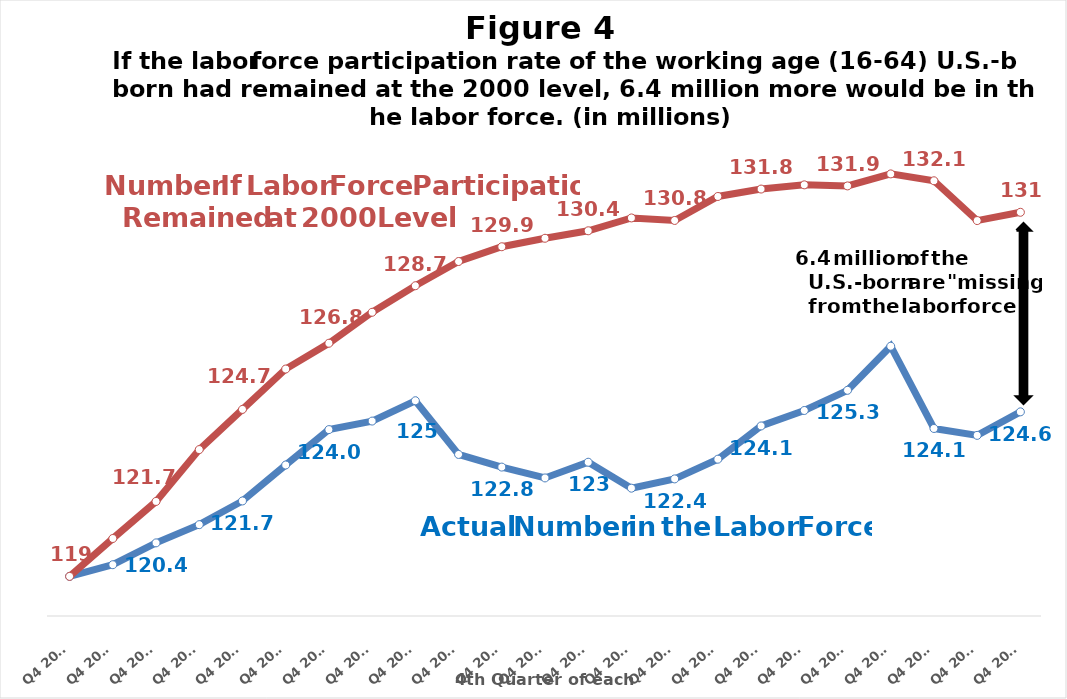
| Category |  Actual number  in the labor force  | Series 1 |
|---|---|---|
| Q4 2000 | 119.279 | 119.279 |
| Q4 2001 | 119.656 | 120.503 |
| Q4 2002 | 120.361 | 121.699 |
| Q4 2003 | 120.95 | 123.374 |
| Q4 2004 | 121.715 | 124.672 |
| Q4 2005 | 122.876 | 125.975 |
| Q4 2006 | 124.019 | 126.808 |
| Q4 2007 | 124.295 | 127.809 |
| Q4 2008 | 124.951 | 128.666 |
| Q4 2009 | 123.217 | 129.448 |
| Q4 2010 | 122.809 | 129.924 |
| Q4 2011 | 122.458 | 130.199 |
| Q4 2012 | 122.966 | 130.44 |
| Q4 2013 | 122.128 | 130.855 |
| Q4 2014 | 122.427 | 130.774 |
| Q4 2015 | 123.064 | 131.548 |
| Q4 2016 | 124.138 | 131.788 |
| Q4 2017 | 124.637 | 131.923 |
| Q4 2018 | 125.288 | 131.889 |
| Q4 2019 | 126.712 | 132.277 |
| Q4 2020 | 124.056 | 132.055 |
| Q4 2021 | 123.833 | 130.77 |
| Q4 2022 | 124.593 | 131.037 |